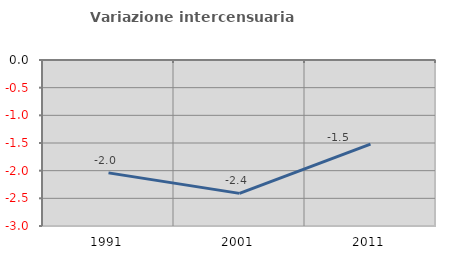
| Category | Variazione intercensuaria annua |
|---|---|
| 1991.0 | -2.04 |
| 2001.0 | -2.41 |
| 2011.0 | -1.521 |